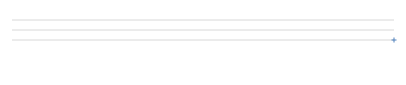
| Category | Series 0 |
|---|---|
| -6.5 | 0 |
| -5.055555555555556 | 0 |
| 6.5 | 0 |